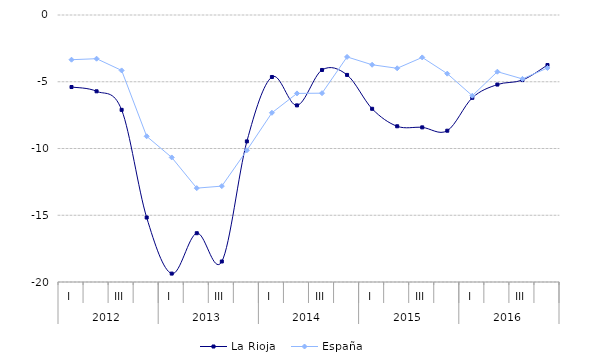
| Category | La Rioja  | España |
|---|---|---|
| 0 | -5.395 | -3.349 |
| 1 | -5.716 | -3.273 |
| 2 | -7.105 | -4.152 |
| 3 | -15.17 | -9.086 |
| 4 | -19.37 | -10.67 |
| 5 | -16.346 | -12.968 |
| 6 | -18.463 | -12.818 |
| 7 | -9.468 | -10.133 |
| 8 | -4.643 | -7.325 |
| 9 | -6.77 | -5.874 |
| 10 | -4.118 | -5.856 |
| 11 | -4.488 | -3.14 |
| 12 | -7.026 | -3.728 |
| 13 | -8.335 | -3.991 |
| 14 | -8.417 | -3.177 |
| 15 | -8.668 | -4.395 |
| 16 | -6.202 | -6.047 |
| 17 | -5.21 | -4.247 |
| 18 | -4.874 | -4.787 |
| 19 | -3.75 | -3.967 |